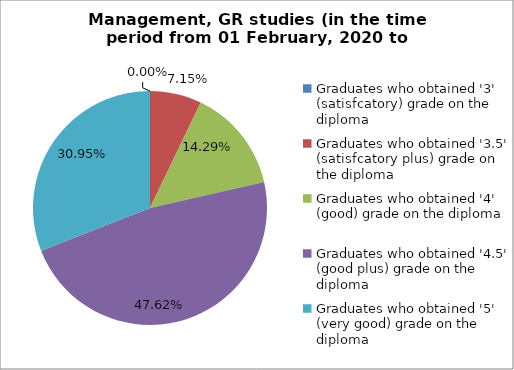
| Category | Series 0 |
|---|---|
| Graduates who obtained '3' (satisfcatory) grade on the diploma | 0 |
| Graduates who obtained '3.5' (satisfcatory plus) grade on the diploma | 7.143 |
| Graduates who obtained '4' (good) grade on the diploma | 14.286 |
| Graduates who obtained '4.5' (good plus) grade on the diploma | 47.619 |
| Graduates who obtained '5' (very good) grade on the diploma | 30.952 |